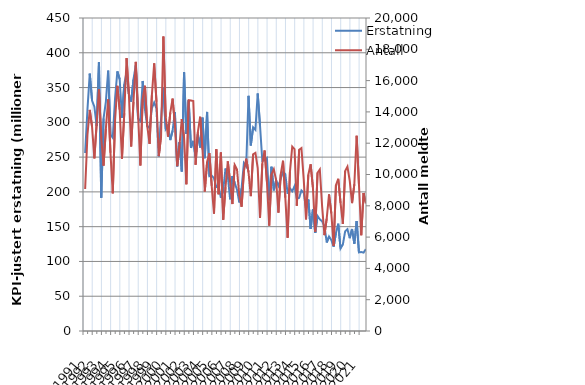
| Category | Erstatning |
|---|---|
| 1991.0 | 255.886 |
| nan | 318.368 |
| nan | 370.015 |
| nan | 331.4 |
| 1992.0 | 322.6 |
| nan | 294.766 |
| nan | 386.29 |
| nan | 191.585 |
| 1993.0 | 305.63 |
| nan | 329.304 |
| nan | 374.392 |
| nan | 282.696 |
| 1994.0 | 277.884 |
| nan | 334.599 |
| nan | 373.218 |
| nan | 362.084 |
| 1995.0 | 306.575 |
| nan | 354.65 |
| nan | 372.432 |
| nan | 341.038 |
| 1996.0 | 329.703 |
| nan | 361.938 |
| nan | 381.874 |
| nan | 305.3 |
| 1997.0 | 301.841 |
| nan | 359.509 |
| nan | 318.212 |
| nan | 294.175 |
| 1998.0 | 291.982 |
| nan | 320.299 |
| nan | 328.44 |
| nan | 319.603 |
| 1999.0 | 251.08 |
| nan | 304.66 |
| nan | 350.136 |
| nan | 290.408 |
| 2000.0 | 296.025 |
| nan | 274.529 |
| nan | 287.968 |
| nan | 314.82 |
| 2001.0 | 236.741 |
| nan | 271.533 |
| nan | 229.297 |
| nan | 371.9 |
| 2002.0 | 283.153 |
| nan | 331.963 |
| nan | 263.258 |
| nan | 273.322 |
| 2003.0 | 249.725 |
| nan | 282.969 |
| nan | 263.856 |
| nan | 306.798 |
| 2004.0 | 248.466 |
| nan | 314.976 |
| nan | 222.537 |
| nan | 223.466 |
| 2005.0 | 219.654 |
| nan | 207.02 |
| nan | 207.879 |
| nan | 191.437 |
| 2006.0 | 201.986 |
| nan | 233.583 |
| nan | 222.779 |
| nan | 189.37 |
| 2007.0 | 222.799 |
| nan | 212.832 |
| nan | 202.982 |
| nan | 184.866 |
| 2008.0 | 205.392 |
| nan | 241.499 |
| nan | 236.674 |
| nan | 338.103 |
| 2009.0 | 266.73 |
| nan | 292.74 |
| nan | 289.075 |
| nan | 341.428 |
| 2010.0 | 295.394 |
| nan | 244.587 |
| nan | 245.591 |
| nan | 248.519 |
| 2011.0 | 187.974 |
| nan | 236.129 |
| nan | 202.189 |
| nan | 217.026 |
| 2012.0 | 208.677 |
| nan | 218.734 |
| nan | 228.597 |
| nan | 225.594 |
| 2013.0 | 197.36 |
| nan | 205.137 |
| nan | 200.921 |
| nan | 208.167 |
| 2014.0 | 190.199 |
| nan | 191.416 |
| nan | 202.081 |
| nan | 198.936 |
| 2015.0 | 175.56 |
| nan | 189.155 |
| nan | 146.829 |
| nan | 174.991 |
| 2016.0 | 140.925 |
| nan | 165.396 |
| nan | 160.531 |
| nan | 157.627 |
| 2017.0 | 150.777 |
| nan | 127.258 |
| nan | 135.895 |
| nan | 130.672 |
| 2018.0 | 121.18 |
| nan | 140.64 |
| nan | 154.302 |
| nan | 118.645 |
| 2019.0 | 124.255 |
| nan | 143.17 |
| nan | 146.364 |
| nan | 133.443 |
| 2020.0 | 146.649 |
| nan | 125.513 |
| nan | 158.098 |
| nan | 113.015 |
| 2021.0 | 113.516 |
| nan | 112.697 |
| nan | 117.664 |